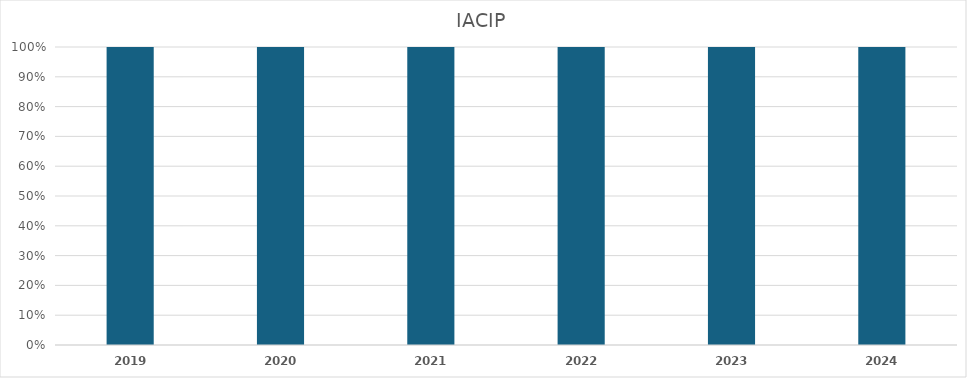
| Category | IACIP |
|---|---|
| 2019.0 | 1 |
| 2020.0 | 1 |
| 2021.0 | 1 |
| 2022.0 | 1 |
| 2023.0 | 1 |
| 2024.0 | 1 |